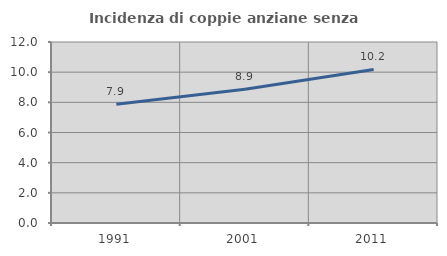
| Category | Incidenza di coppie anziane senza figli  |
|---|---|
| 1991.0 | 7.867 |
| 2001.0 | 8.863 |
| 2011.0 | 10.178 |